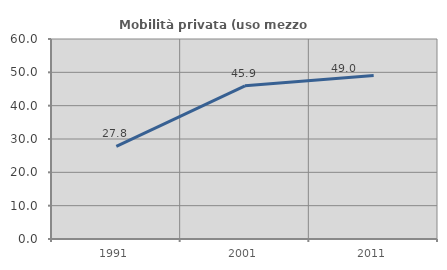
| Category | Mobilità privata (uso mezzo privato) |
|---|---|
| 1991.0 | 27.795 |
| 2001.0 | 45.946 |
| 2011.0 | 49.014 |